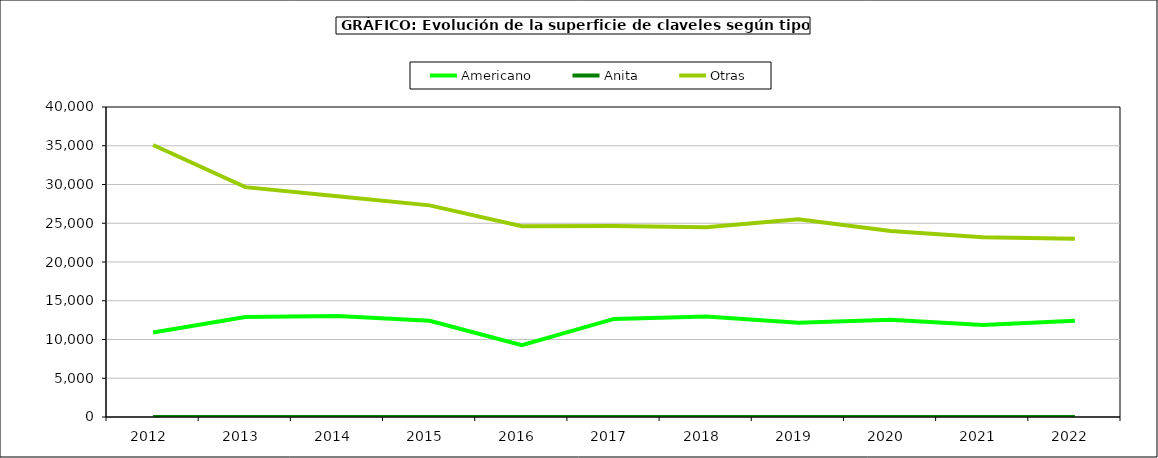
| Category | Americano | Anita | Otras |
|---|---|---|---|
| 2012.0 | 10894 | 0 | 35100 |
| 2013.0 | 12913 | 0 | 29659 |
| 2014.0 | 13022 | 0 | 28479 |
| 2015.0 | 12405 | 0 | 27308 |
| 2016.0 | 9252 | 0 | 24628 |
| 2017.0 | 12655 | 0 | 24631 |
| 2018.0 | 12974 | 0 | 24470 |
| 2019.0 | 12146 | 8 | 25500 |
| 2020.0 | 12548 | 12 | 23994 |
| 2021.0 | 11870 | 12 | 23179 |
| 2022.0 | 12408 | 12 | 23000 |